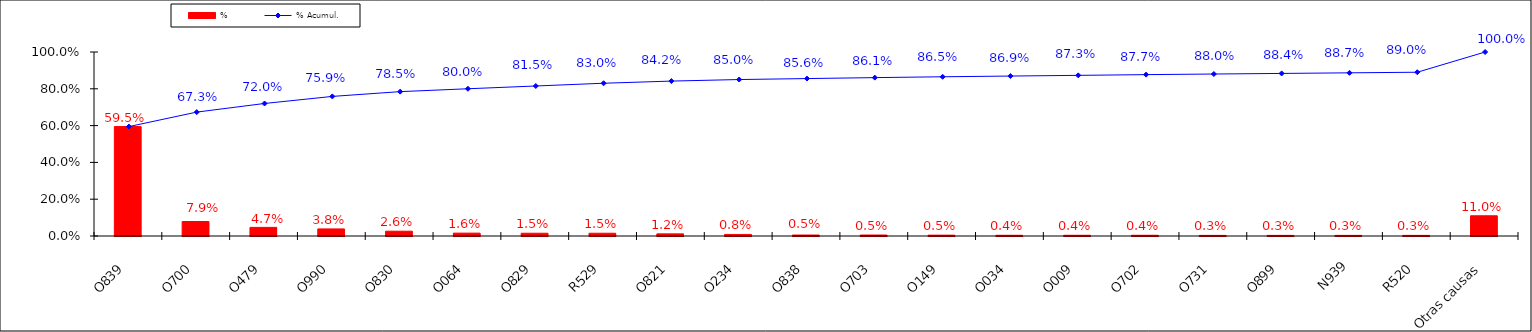
| Category | % |
|---|---|
| O839 | 0.595 |
| O700 | 0.079 |
| O479 | 0.047 |
| O990 | 0.038 |
| O830 | 0.026 |
| O064 | 0.016 |
| O829 | 0.015 |
| R529 | 0.015 |
| O821 | 0.012 |
| O234 | 0.008 |
| O838 | 0.005 |
| O703 | 0.005 |
| O149 | 0.005 |
| O034 | 0.004 |
| O009 | 0.004 |
| O702 | 0.004 |
| O731 | 0.003 |
| O899 | 0.003 |
| N939 | 0.003 |
| R520 | 0.003 |
| Otras causas | 0.11 |